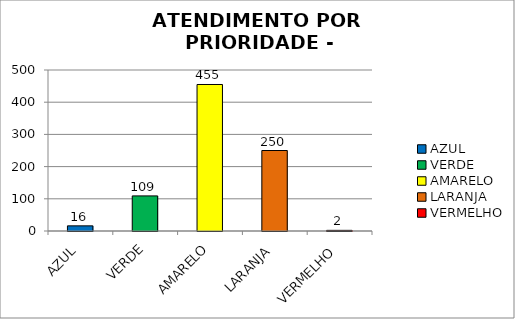
| Category | Total Regional: |
|---|---|
| AZUL | 16 |
| VERDE | 109 |
| AMARELO | 455 |
| LARANJA | 250 |
| VERMELHO | 2 |